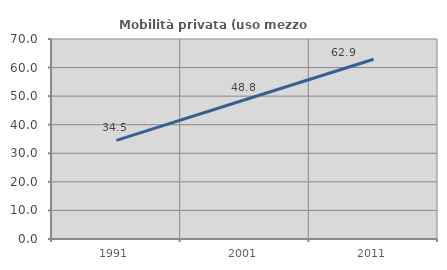
| Category | Mobilità privata (uso mezzo privato) |
|---|---|
| 1991.0 | 34.536 |
| 2001.0 | 48.75 |
| 2011.0 | 62.896 |